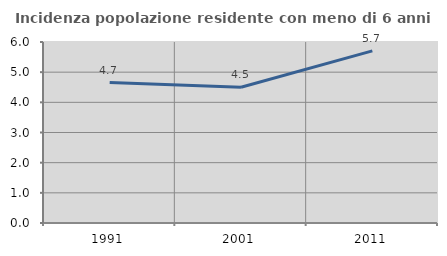
| Category | Incidenza popolazione residente con meno di 6 anni |
|---|---|
| 1991.0 | 4.657 |
| 2001.0 | 4.499 |
| 2011.0 | 5.707 |